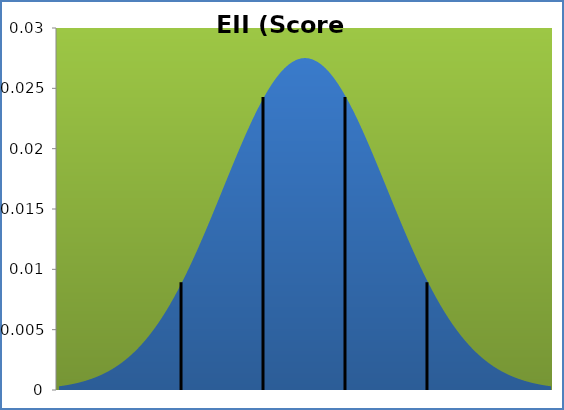
| Category | densité |
|---|---|
| -0.20000000000000284 | 0 |
| 0.5249999999999986 | 0 |
| 1.25 | 0 |
| 1.9749999999999943 | 0 |
| 2.6999999999999957 | 0.001 |
| 3.424999999999997 | 0.001 |
| 4.149999999999999 | 0.001 |
| 4.875 | 0.001 |
| 5.599999999999994 | 0.001 |
| 6.324999999999996 | 0.001 |
| 7.049999999999997 | 0.001 |
| 7.774999999999999 | 0.001 |
| 8.5 | 0.002 |
| 9.224999999999994 | 0.002 |
| 9.949999999999996 | 0.002 |
| 10.674999999999997 | 0.002 |
| 11.399999999999999 | 0.002 |
| 12.124999999999996 | 0.003 |
| 12.849999999999998 | 0.003 |
| 13.574999999999996 | 0.003 |
| 14.299999999999997 | 0.004 |
| 15.024999999999999 | 0.004 |
| 15.749999999999996 | 0.005 |
| 16.474999999999998 | 0.005 |
| 17.199999999999996 | 0.005 |
| 17.924999999999997 | 0.006 |
| 18.65 | 0.006 |
| 19.374999999999996 | 0.007 |
| 20.099999999999998 | 0.008 |
| 20.824999999999996 | 0.008 |
| 21.549999999999997 | 0.009 |
| 22.275 | 0.01 |
| 22.999999999999996 | 0.01 |
| 23.724999999999998 | 0.011 |
| 24.449999999999996 | 0.012 |
| 25.174999999999997 | 0.013 |
| 25.9 | 0.013 |
| 26.624999999999996 | 0.014 |
| 27.349999999999998 | 0.015 |
| 28.074999999999996 | 0.016 |
| 28.799999999999997 | 0.017 |
| 29.525 | 0.018 |
| 30.249999999999996 | 0.018 |
| 30.974999999999998 | 0.019 |
| 31.699999999999996 | 0.02 |
| 32.425 | 0.021 |
| 33.15 | 0.022 |
| 33.875 | 0.022 |
| 34.599999999999994 | 0.023 |
| 35.324999999999996 | 0.024 |
| 36.05 | 0.024 |
| 36.775 | 0.025 |
| 37.5 | 0.025 |
| 38.224999999999994 | 0.026 |
| 38.949999999999996 | 0.026 |
| 39.675 | 0.027 |
| 40.4 | 0.027 |
| 41.125 | 0.027 |
| 41.849999999999994 | 0.027 |
| 42.574999999999996 | 0.027 |
| 43.3 | 0.028 |
| 44.025 | 0.027 |
| 44.75 | 0.027 |
| 45.474999999999994 | 0.027 |
| 46.199999999999996 | 0.027 |
| 46.925 | 0.027 |
| 47.65 | 0.026 |
| 48.375 | 0.026 |
| 49.099999999999994 | 0.025 |
| 49.824999999999996 | 0.025 |
| 50.55 | 0.024 |
| 51.275 | 0.024 |
| 52.0 | 0.023 |
| 52.724999999999994 | 0.022 |
| 53.449999999999996 | 0.022 |
| 54.175 | 0.021 |
| 54.9 | 0.02 |
| 55.625 | 0.019 |
| 56.349999999999994 | 0.018 |
| 57.074999999999996 | 0.018 |
| 57.8 | 0.017 |
| 58.525 | 0.016 |
| 59.25 | 0.015 |
| 59.974999999999994 | 0.014 |
| 60.699999999999996 | 0.013 |
| 61.425 | 0.013 |
| 62.15 | 0.012 |
| 62.875 | 0.011 |
| 63.599999999999994 | 0.01 |
| 64.32499999999999 | 0.01 |
| 65.05 | 0.009 |
| 65.775 | 0.008 |
| 66.5 | 0.008 |
| 67.225 | 0.007 |
| 67.94999999999999 | 0.006 |
| 68.675 | 0.006 |
| 69.4 | 0.005 |
| 70.125 | 0.005 |
| 70.85 | 0.005 |
| 71.57499999999999 | 0.004 |
| 72.3 | 0.004 |
| 73.025 | 0.003 |
| 73.75 | 0.003 |
| 74.475 | 0.003 |
| 75.19999999999999 | 0.002 |
| 75.925 | 0.002 |
| 76.65 | 0.002 |
| 77.375 | 0.002 |
| 78.1 | 0.002 |
| 78.82499999999999 | 0.001 |
| 79.55 | 0.001 |
| 80.275 | 0.001 |
| 81.0 | 0.001 |
| 81.725 | 0.001 |
| 82.44999999999999 | 0.001 |
| 83.175 | 0.001 |
| 83.9 | 0.001 |
| 84.625 | 0 |
| 85.35 | 0 |
| 86.07499999999999 | 0 |
| 86.8 | 0 |